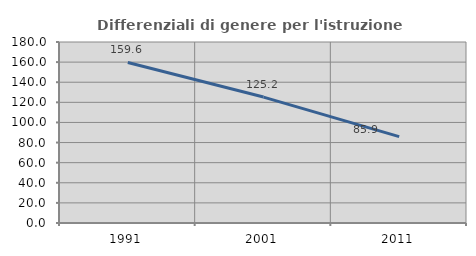
| Category | Differenziali di genere per l'istruzione superiore |
|---|---|
| 1991.0 | 159.649 |
| 2001.0 | 125.235 |
| 2011.0 | 85.895 |